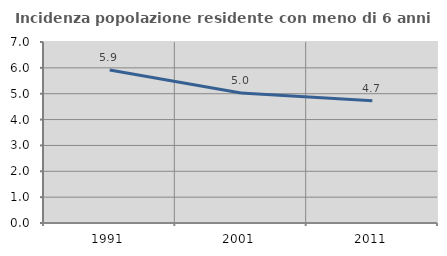
| Category | Incidenza popolazione residente con meno di 6 anni |
|---|---|
| 1991.0 | 5.92 |
| 2001.0 | 5.027 |
| 2011.0 | 4.731 |